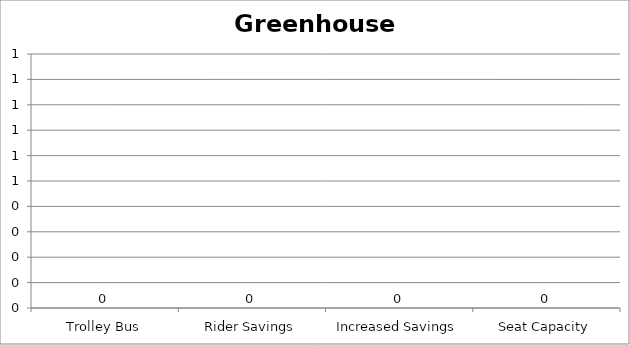
| Category | Greenhouse Gas |
|---|---|
| Trolley Bus | 0 |
| Rider Savings | 0 |
| Increased Savings | 0 |
| Seat Capacity | 0 |